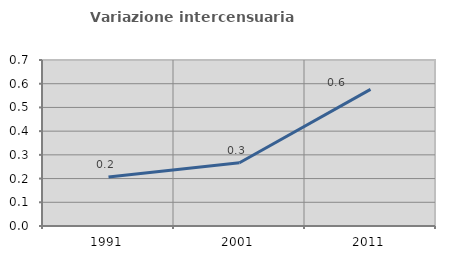
| Category | Variazione intercensuaria annua |
|---|---|
| 1991.0 | 0.207 |
| 2001.0 | 0.267 |
| 2011.0 | 0.576 |